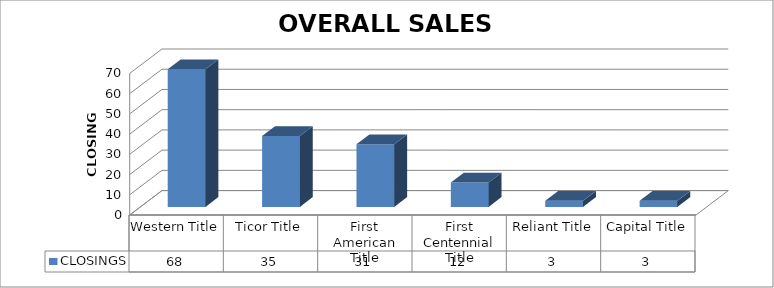
| Category | CLOSINGS |
|---|---|
| Western Title | 68 |
| Ticor Title | 35 |
| First American Title | 31 |
| First Centennial Title | 12 |
| Reliant Title | 3 |
| Capital Title | 3 |